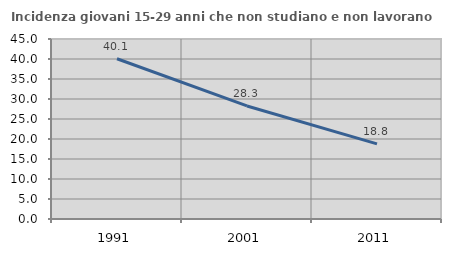
| Category | Incidenza giovani 15-29 anni che non studiano e non lavorano  |
|---|---|
| 1991.0 | 40.07 |
| 2001.0 | 28.264 |
| 2011.0 | 18.776 |